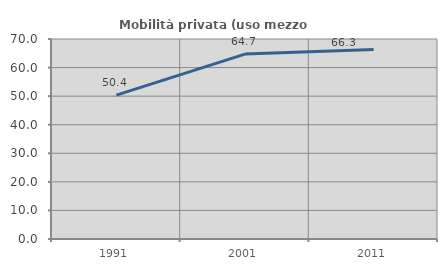
| Category | Mobilità privata (uso mezzo privato) |
|---|---|
| 1991.0 | 50.362 |
| 2001.0 | 64.709 |
| 2011.0 | 66.3 |